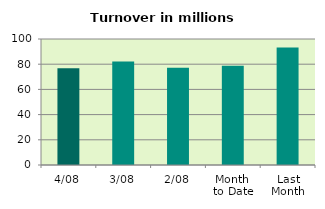
| Category | Series 0 |
|---|---|
| 4/08 | 76.879 |
| 3/08 | 82.053 |
| 2/08 | 77.165 |
| Month 
to Date | 78.699 |
| Last
Month | 93.279 |